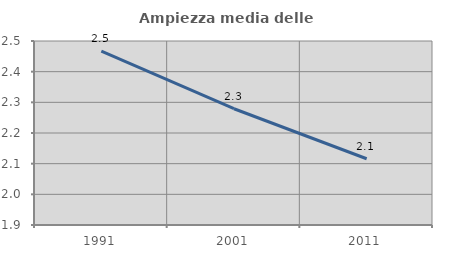
| Category | Ampiezza media delle famiglie |
|---|---|
| 1991.0 | 2.467 |
| 2001.0 | 2.279 |
| 2011.0 | 2.116 |